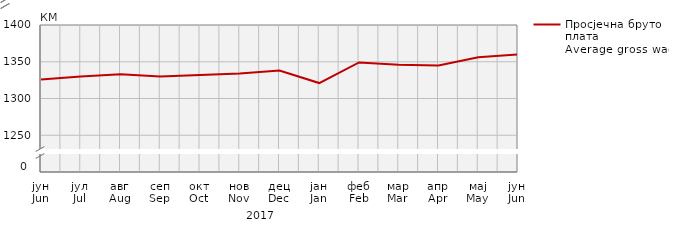
| Category | Просјечна бруто плата
Average gross wage |
|---|---|
| јун
Jun | 1326 |
| јул
Jul | 1330 |
| авг
Aug | 1333 |
| сеп
Sep | 1330 |
| окт
Oct | 1332 |
| нов
Nov | 1334 |
| дец
Dec | 1338 |
| јан
Jan | 1321 |
| феб
Feb | 1349 |
| мар
Mar | 1346 |
| апр
Apr | 1345 |
| мај
May | 1356 |
| јун
Jun | 1360 |